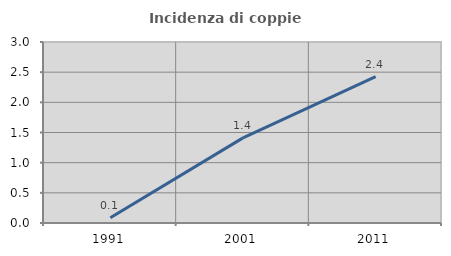
| Category | Incidenza di coppie miste |
|---|---|
| 1991.0 | 0.087 |
| 2001.0 | 1.411 |
| 2011.0 | 2.426 |